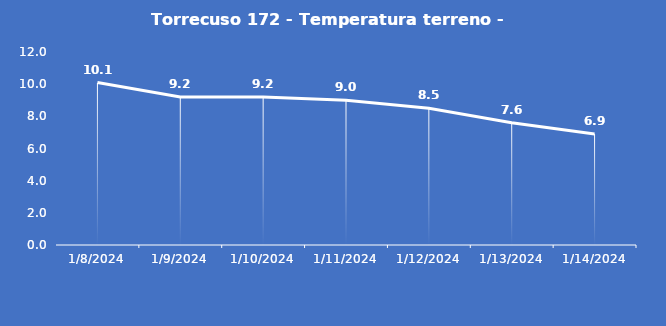
| Category | Torrecuso 172 - Temperatura terreno - Grezzo (°C) |
|---|---|
| 1/8/24 | 10.1 |
| 1/9/24 | 9.2 |
| 1/10/24 | 9.2 |
| 1/11/24 | 9 |
| 1/12/24 | 8.5 |
| 1/13/24 | 7.6 |
| 1/14/24 | 6.9 |